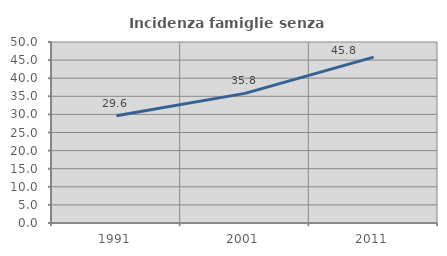
| Category | Incidenza famiglie senza nuclei |
|---|---|
| 1991.0 | 29.64 |
| 2001.0 | 35.804 |
| 2011.0 | 45.81 |